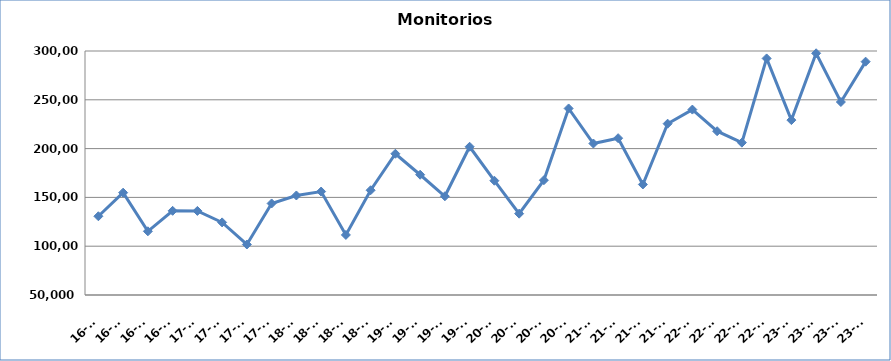
| Category | Monitorios ingresados |
|---|---|
| 16-T1 | 130680 |
| 16-T2 | 154860 |
| 16-T3 | 115269 |
| 16-T4 | 136245 |
| 17-T1 | 136155 |
| 17-T2 | 124382 |
| 17-T3 | 101751 |
| 17-T4 | 143788 |
| 18-T1 | 151974 |
| 18-T2 | 155991 |
| 18-T3 | 111544 |
| 18-T4 | 157337 |
| 19-T1 | 194715 |
| 19-T2 | 173225 |
| 19-T3 | 151156 |
| 19-T4 | 201895 |
| 20-T1 | 167095 |
| 20-T2 | 133351 |
| 20-T3 | 167630 |
| 20-T4 | 241119 |
| 21-T1 | 205212 |
| 21-T2 | 210679 |
| 21-T3 | 163259 |
| 21-T4 | 225536 |
| 22-T1 | 239972 |
| 22-T2 | 217801 |
| 22-T3 | 206093 |
| 22-T4 | 292388 |
| 23-T1 | 229179 |
| 23-T2 | 297658 |
| 23-T3 | 247739 |
| 23-T4 | 289096 |